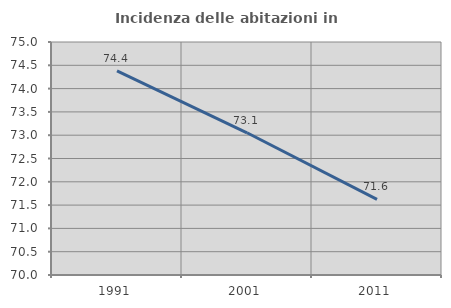
| Category | Incidenza delle abitazioni in proprietà  |
|---|---|
| 1991.0 | 74.382 |
| 2001.0 | 73.052 |
| 2011.0 | 71.624 |